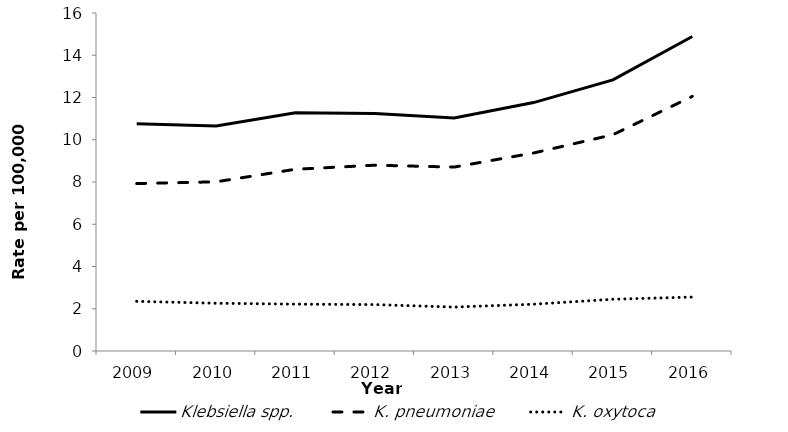
| Category | Klebsiella spp. | K. pneumoniae | K. oxytoca |
|---|---|---|---|
| 2009.0 | 10.757 | 7.926 | 2.351 |
| 2010.0 | 10.657 | 8.009 | 2.261 |
| 2011.0 | 11.281 | 8.603 | 2.218 |
| 2012.0 | 11.248 | 8.795 | 2.197 |
| 2013.0 | 11.031 | 8.707 | 2.079 |
| 2014.0 | 11.759 | 9.373 | 2.215 |
| 2015.0 | 12.833 | 10.238 | 2.45 |
| 2016.0 | 14.885 | 12.052 | 2.554 |